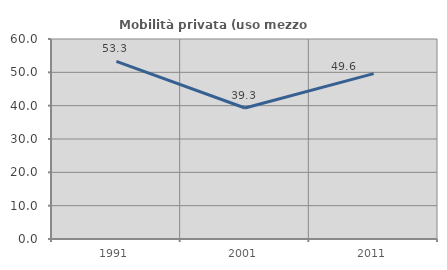
| Category | Mobilità privata (uso mezzo privato) |
|---|---|
| 1991.0 | 53.266 |
| 2001.0 | 39.295 |
| 2011.0 | 49.618 |